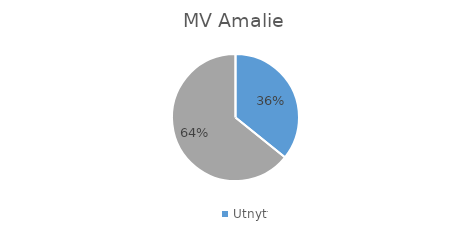
| Category | Series 0 |
|---|---|
| 0 | 0.358 |
| 1 | 0.642 |